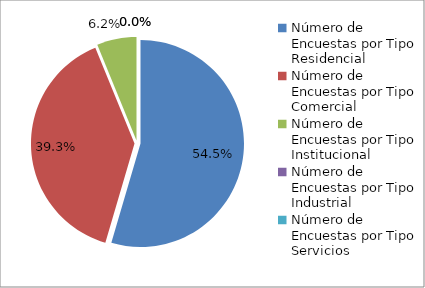
| Category | Series 0 |
|---|---|
| 0 | 150 |
| 1 | 108 |
| 2 | 17 |
| 3 | 0 |
| 4 | 0 |